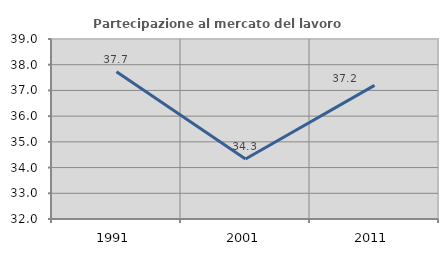
| Category | Partecipazione al mercato del lavoro  femminile |
|---|---|
| 1991.0 | 37.73 |
| 2001.0 | 34.332 |
| 2011.0 | 37.195 |